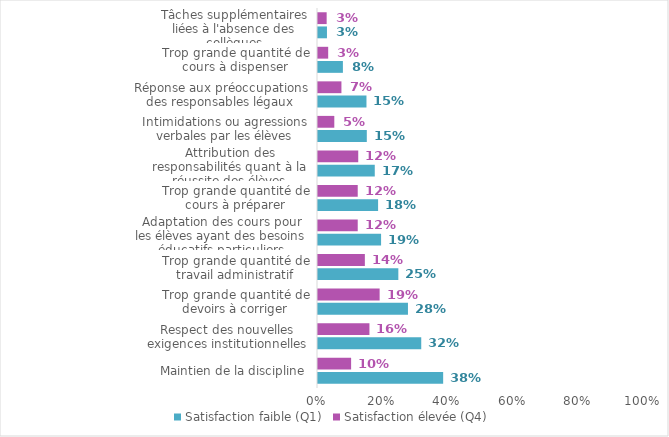
| Category | Satisfaction faible (Q1) | Satisfaction élevée (Q4) |
|---|---|---|
| Maintien de la discipline | 0.383 | 0.101 |
| Respect des nouvelles exigences institutionnelles | 0.316 | 0.157 |
| Trop grande quantité de devoirs à corriger | 0.275 | 0.188 |
| Trop grande quantité de travail administratif | 0.246 | 0.143 |
| Adaptation des cours pour les élèves ayant des besoins éducatifs particuliers | 0.193 | 0.121 |
| Trop grande quantité de cours à préparer | 0.184 | 0.121 |
| Attribution des responsabilités quant à la réussite des élèves | 0.174 | 0.123 |
| Intimidations ou agressions verbales par les élèves | 0.149 | 0.05 |
| Réponse aux préoccupations des responsables légaux | 0.148 | 0.072 |
| Trop grande quantité de cours à dispenser | 0.076 | 0.031 |
| Tâches supplémentaires liées à l'absence des collègues | 0.027 | 0.026 |